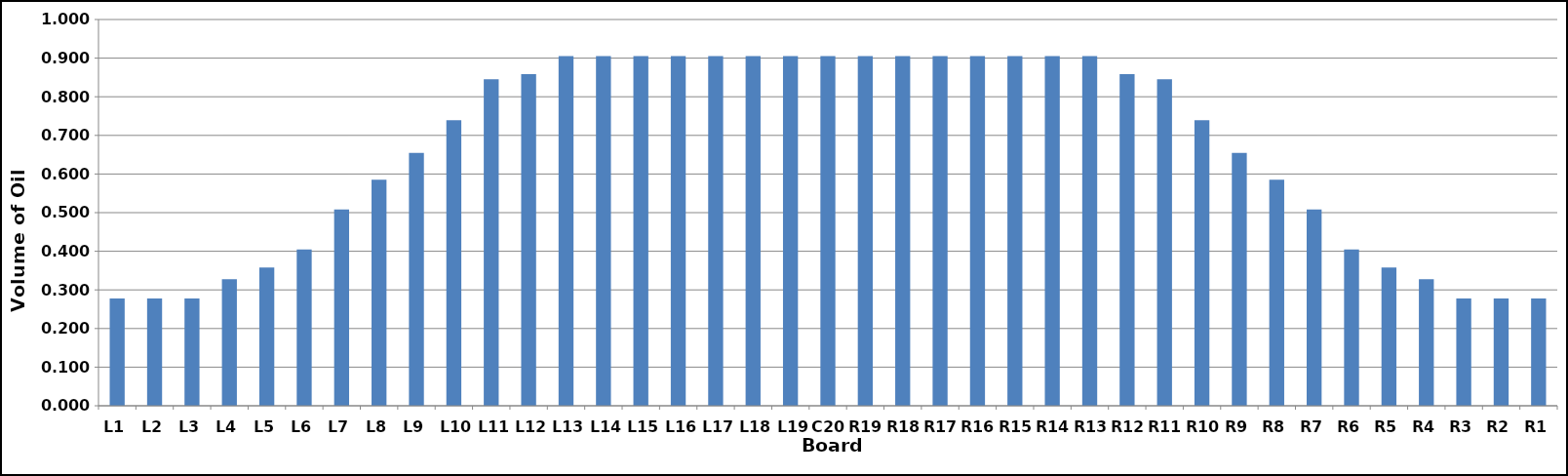
| Category | Series 0 |
|---|---|
| L1 | 0.277 |
| L2 | 0.277 |
| L3 | 0.277 |
| L4 | 0.328 |
| L5 | 0.358 |
| L6 | 0.405 |
| L7 | 0.508 |
| L8 | 0.585 |
| L9 | 0.655 |
| L10 | 0.739 |
| L11 | 0.845 |
| L12 | 0.858 |
| L13 | 0.905 |
| L14 | 0.905 |
| L15 | 0.905 |
| L16 | 0.905 |
| L17 | 0.905 |
| L18 | 0.905 |
| L19 | 0.905 |
| C20 | 0.905 |
| R19 | 0.905 |
| R18 | 0.905 |
| R17 | 0.905 |
| R16 | 0.905 |
| R15 | 0.905 |
| R14 | 0.905 |
| R13 | 0.905 |
| R12 | 0.858 |
| R11 | 0.845 |
| R10 | 0.739 |
| R9 | 0.655 |
| R8 | 0.585 |
| R7 | 0.508 |
| R6 | 0.405 |
| R5 | 0.358 |
| R4 | 0.328 |
| R3 | 0.277 |
| R2 | 0.277 |
| R1 | 0.277 |